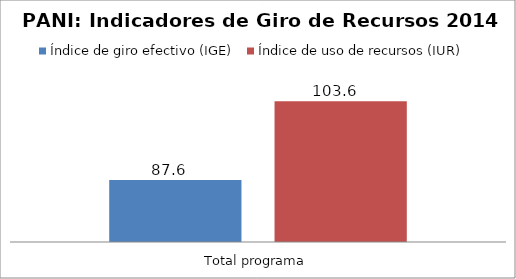
| Category | Índice de giro efectivo (IGE) | Índice de uso de recursos (IUR)  |
|---|---|---|
| Total programa | 87.626 | 103.633 |